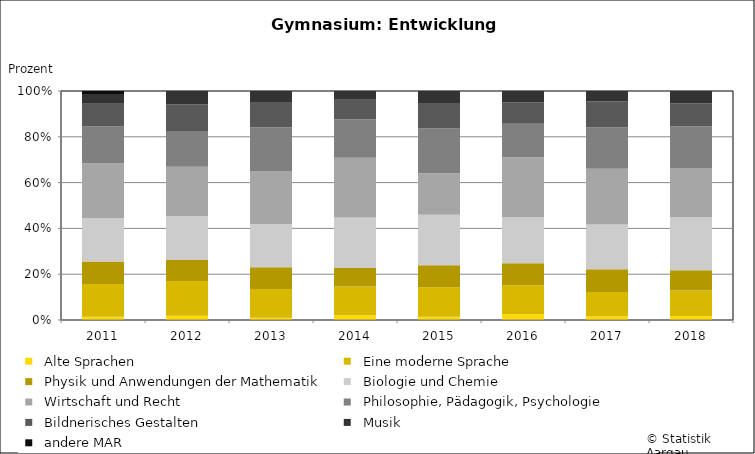
| Category |   Alte Sprachen |   Eine moderne Sprache |   Physik und Anwendungen der Mathematik |   Biologie und Chemie |   Wirtschaft und Recht |   Philosophie, Pädagogik, Psychologie |   Bildnerisches Gestalten |   Musik |   andere MAR |
|---|---|---|---|---|---|---|---|---|---|
| 2011 | 13 | 136 | 93 | 180 | 226 | 152 | 94 | 41 | 12 |
| 2012 | 17 | 141 | 85 | 178 | 200 | 145 | 108 | 54 | 0 |
| 2013 | 10 | 127 | 96 | 192 | 232 | 196 | 108 | 52 | 0 |
| 2014 | 22 | 132 | 84 | 232 | 274 | 176 | 90 | 40 | 0 |
| 2015 | 14 | 131 | 98 | 224 | 184 | 199 | 113 | 53 | 0 |
| 2016 | 25 | 127 | 96 | 202 | 261 | 147 | 93 | 50 | 0 |
| 2017 | 17 | 113 | 105 | 208 | 259 | 191 | 122 | 47 | 0 |
| 2018 | 18 | 114 | 90 | 237 | 219 | 187 | 101 | 56 | 0 |